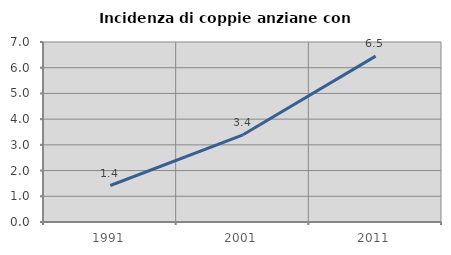
| Category | Incidenza di coppie anziane con figli |
|---|---|
| 1991.0 | 1.418 |
| 2001.0 | 3.39 |
| 2011.0 | 6.452 |